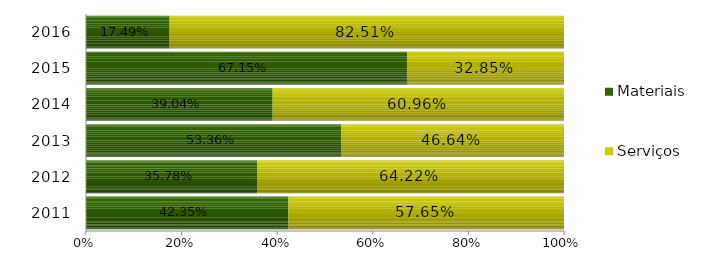
| Category | Materiais | Serviços |
|---|---|---|
| 2011.0 | 0.423 | 0.577 |
| 2012.0 | 0.358 | 0.642 |
| 2013.0 | 0.534 | 0.466 |
| 2014.0 | 0.39 | 0.61 |
| 2015.0 | 0.671 | 0.329 |
| 2016.0 | 0.175 | 0.825 |